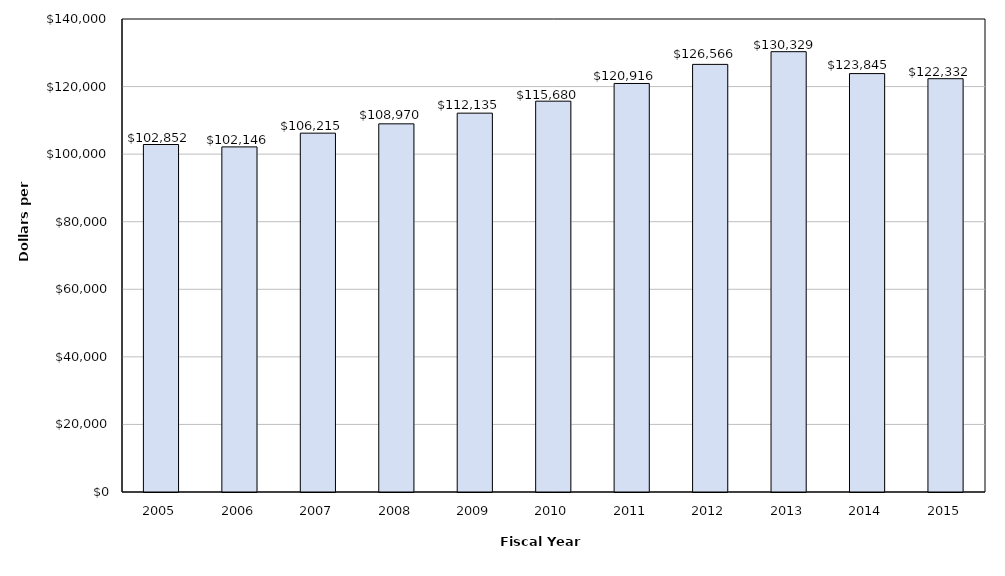
| Category | Total Revenue |
|---|---|
| 2005.0 | 102852 |
| 2006.0 | 102146 |
| 2007.0 | 106215 |
| 2008.0 | 108970 |
| 2009.0 | 112135 |
| 2010.0 | 115680 |
| 2011.0 | 120916 |
| 2012.0 | 126566 |
| 2013.0 | 130329 |
| 2014.0 | 123845 |
| 2015.0 | 122332 |